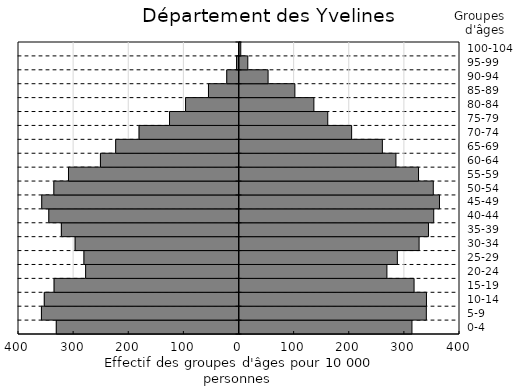
| Category | Hommes | Femmes  |
|---|---|---|
| 0-4 | -331.437 | 312.849 |
| 5-9 | -358.388 | 338.923 |
| 10-14 | -353.223 | 339.157 |
| 15-19 | -335.442 | 316.688 |
| 20-24 | -278.213 | 267.407 |
| 25-29 | -281.306 | 286.347 |
| 30-34 | -297.278 | 325.81 |
| 35-39 | -322.233 | 342.803 |
| 40-44 | -345.027 | 352.332 |
| 45-49 | -357.849 | 362.8 |
| 50-54 | -335.864 | 351.545 |
| 55-59 | -309.307 | 324.753 |
| 60-64 | -251.359 | 283.785 |
| 65-69 | -223.718 | 259.183 |
| 70-74 | -181.286 | 203.424 |
| 75-79 | -126.025 | 160.101 |
| 80-84 | -96.934 | 134.932 |
| 85-89 | -55.358 | 100.469 |
| 90-94 | -22.2 | 51.864 |
| 95-99 | -4.371 | 15.06 |
| 100-104 | -0.649 | 2.299 |